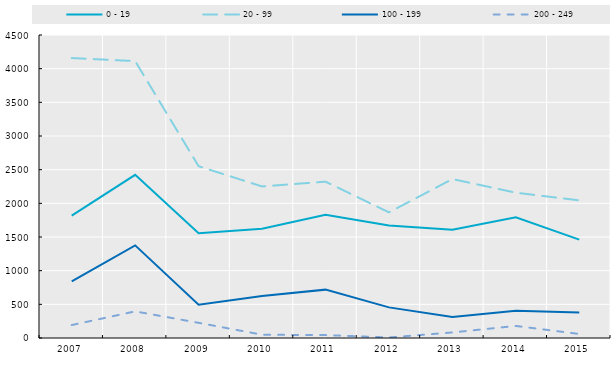
| Category | 0 - 19  | 20 - 99 | 100 - 199  | 200 - 249 |
|---|---|---|---|---|
| 2007.0 | 1816.704 | 4157.858 | 841.269 | 192.115 |
| 2008.0 | 2423.503 | 4112.238 | 1375.567 | 395.395 |
| 2009.0 | 1554.53 | 2551.208 | 492.859 | 225.373 |
| 2010.0 | 1621.853 | 2250.907 | 622.541 | 48.786 |
| 2011.0 | 1830.172 | 2322.152 | 718.243 | 43.127 |
| 2012.0 | 1669.353 | 1866.275 | 454.663 | 7.779 |
| 2013.0 | 1609.294 | 2360.58 | 313.188 | 82.525 |
| 2014.0 | 1794.082 | 2158.056 | 403.621 | 179.331 |
| 2015.0 | 1461.846 | 2044.26 | 379.147 | 59.735 |